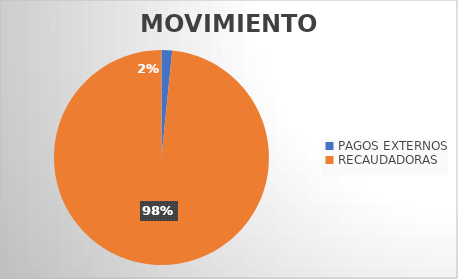
| Category | MOVIMIENTOS |
|---|---|
| PAGOS EXTERNOS | 387 |
| RECAUDADORAS | 23920 |